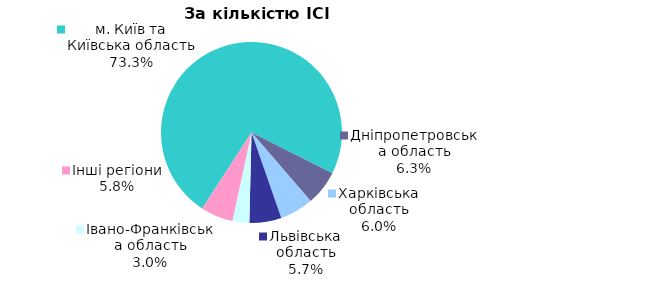
| Category | Series 0 |
|---|---|
| м. Київ та Київська область | 0.733 |
| Дніпропетровська область | 0.063 |
| Харківська область | 0.06 |
| Львівська область | 0.057 |
| Iвано-Франкiвська область | 0.03 |
| Інші регіони | 0.058 |